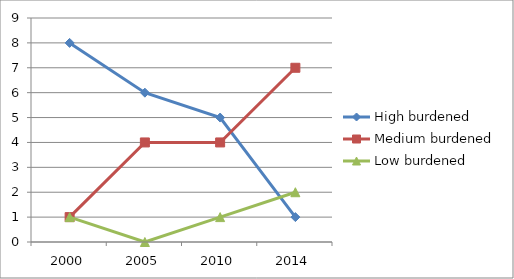
| Category | High burdened | Medium burdened | Low burdened |
|---|---|---|---|
| 2000.0 | 8 | 1 | 1 |
| 2005.0 | 6 | 4 | 0 |
| 2010.0 | 5 | 4 | 1 |
| 2014.0 | 1 | 7 | 2 |